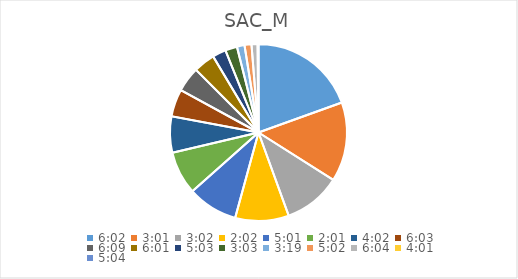
| Category | Series 0 |
|---|---|
| 0.2513888888888889 | 21.746 |
| 0.12569444444444444 | 16.161 |
| 0.12638888888888888 | 11.669 |
| 0.08472222222222221 | 10.916 |
| 0.20902777777777778 | 10.248 |
| 0.08402777777777777 | 8.79 |
| 0.16805555555555554 | 7.371 |
| 0.2520833333333333 | 5.581 |
| 0.25625000000000003 | 5.109 |
| 0.25069444444444444 | 4.375 |
| 0.21041666666666667 | 2.747 |
| 0.12708333333333333 | 2.427 |
| 0.13819444444444443 | 1.542 |
| 0.20972222222222223 | 1.417 |
| 0.25277777777777777 | 1.23 |
| 0.1673611111111111 | 0.122 |
| 0.2111111111111111 | 0.061 |